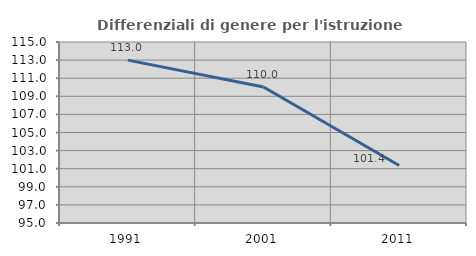
| Category | Differenziali di genere per l'istruzione superiore |
|---|---|
| 1991.0 | 112.996 |
| 2001.0 | 110.02 |
| 2011.0 | 101.351 |